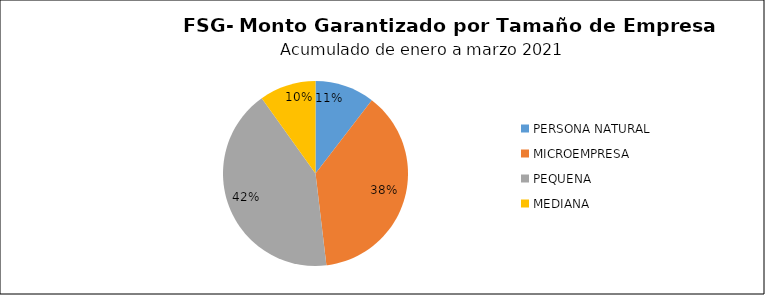
| Category | Monto | Créditos |
|---|---|---|
| PERSONA NATURAL | 1.443 | 201 |
| MICROEMPRESA | 5.22 | 2037 |
| PEQUENA | 5.817 | 441 |
| MEDIANA | 1.367 | 35 |